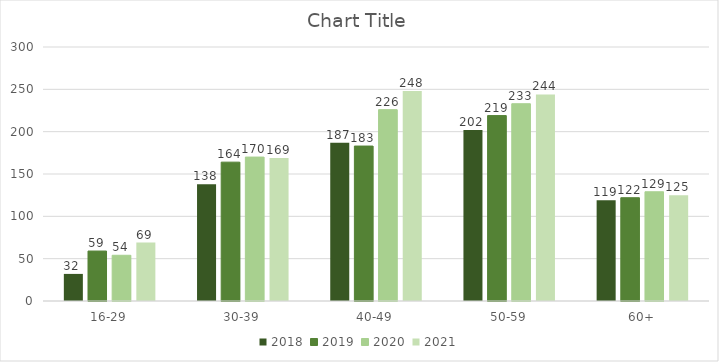
| Category | 2018 | 2019 | 2020 | 2021 |
|---|---|---|---|---|
| 16-29 | 32 | 59 | 54 | 69 |
| 30-39 | 138 | 164 | 170 | 169 |
| 40-49 | 187 | 183 | 226 | 248 |
| 50-59 | 202 | 219 | 233 | 244 |
| 60+ | 119 | 122 | 129 | 125 |